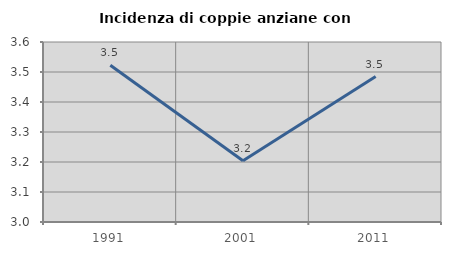
| Category | Incidenza di coppie anziane con figli |
|---|---|
| 1991.0 | 3.523 |
| 2001.0 | 3.204 |
| 2011.0 | 3.485 |